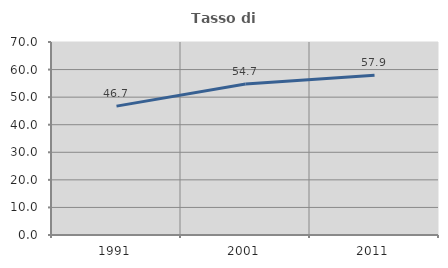
| Category | Tasso di occupazione   |
|---|---|
| 1991.0 | 46.746 |
| 2001.0 | 54.743 |
| 2011.0 | 57.924 |